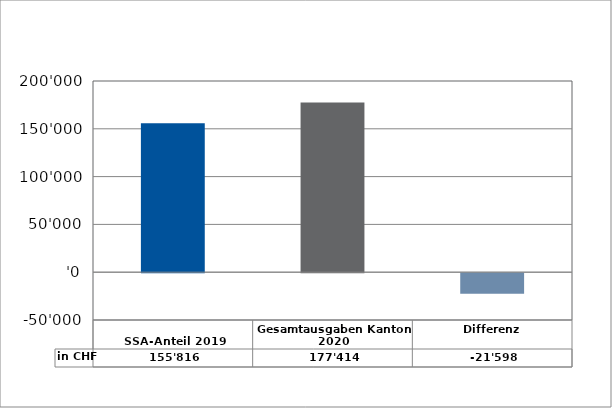
| Category | in CHF |
|---|---|
| 
SSA-Anteil 2019

 | 155816.35 |
| Gesamtausgaben Kanton 2020
 | 177413.9 |
| Differenz | -21597.55 |